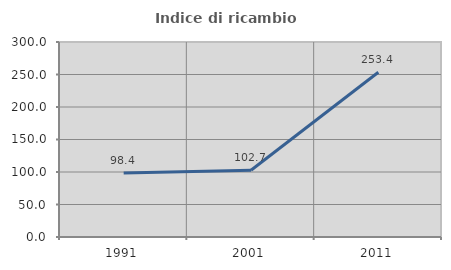
| Category | Indice di ricambio occupazionale  |
|---|---|
| 1991.0 | 98.438 |
| 2001.0 | 102.727 |
| 2011.0 | 253.425 |